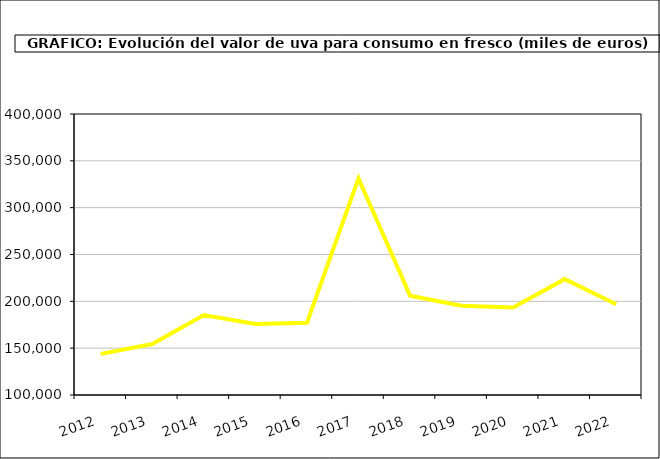
| Category | producción |
|---|---|
| 2012.0 | 143929.55 |
| 2013.0 | 154416.832 |
| 2014.0 | 185423.908 |
| 2015.0 | 175844 |
| 2016.0 | 177191 |
| 2017.0 | 331249.606 |
| 2018.0 | 206099.07 |
| 2019.0 | 195346.773 |
| 2020.0 | 193385.368 |
| 2021.0 | 223711.141 |
| 2022.0 | 196836.874 |